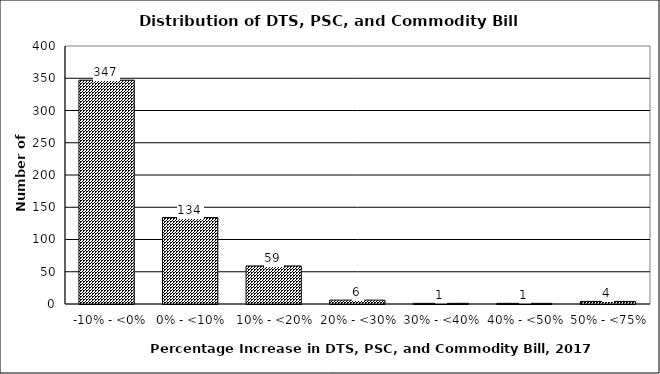
| Category | Series 0 |
|---|---|
|   -10% - <0% | 347 |
|  0% - <10% | 134 |
|  10% - <20% | 59 |
|  20% - <30% | 6 |
|  30% - <40% | 1 |
|  40% - <50% | 1 |
|  50% - <75% | 4 |